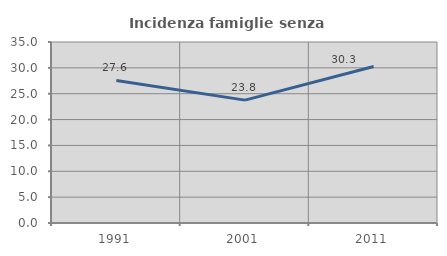
| Category | Incidenza famiglie senza nuclei |
|---|---|
| 1991.0 | 27.562 |
| 2001.0 | 23.763 |
| 2011.0 | 30.263 |